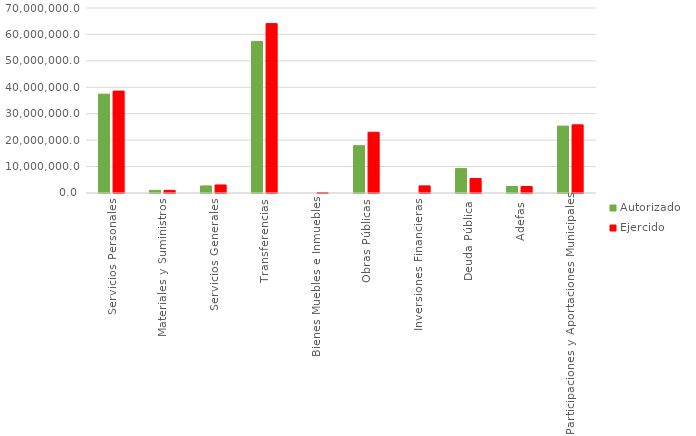
| Category | Autorizado | Ejercido |
|---|---|---|
| Servicios Personales | 37400976 | 38555791.9 |
| Materiales y Suministros | 1007654.6 | 1012718.9 |
| Servicios Generales | 2671441.9 | 3039254.5 |
| Transferencias | 57359240.3 | 64089409.5 |
| Bienes Muebles e Inmuebles | 0 | 113943.6 |
| Obras Públicas | 17902176.9 | 22988306.7 |
| Inversiones Financieras | 0 | 2696822.4 |
| Deuda Pública | 9250255.7 | 5494783.6 |
| Adefas | 2460661.3 | 2460410.7 |
| Participaciones y Aportaciones Municipales | 25313146.3 | 25797157.8 |